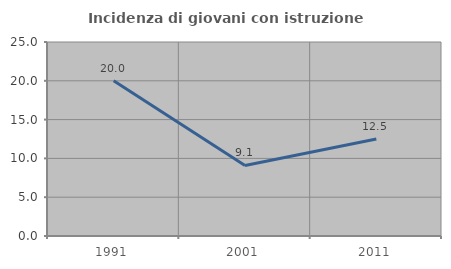
| Category | Incidenza di giovani con istruzione universitaria |
|---|---|
| 1991.0 | 20 |
| 2001.0 | 9.091 |
| 2011.0 | 12.5 |